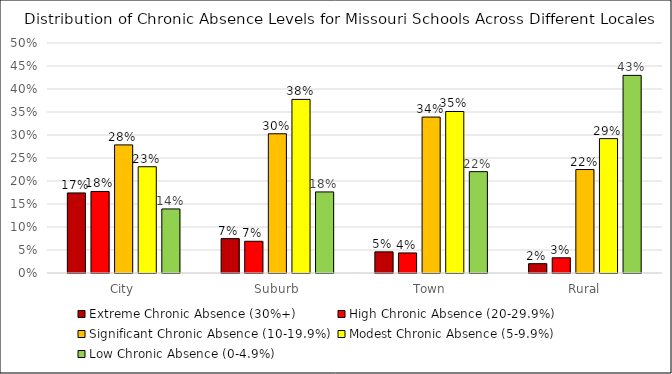
| Category | Extreme Chronic Absence (30%+) | High Chronic Absence (20-29.9%) | Significant Chronic Absence (10-19.9%) | Modest Chronic Absence (5-9.9%) | Low Chronic Absence (0-4.9%) |
|---|---|---|---|---|---|
| City | 0.174 | 0.177 | 0.278 | 0.231 | 0.139 |
| Suburb | 0.075 | 0.069 | 0.303 | 0.377 | 0.176 |
| Town | 0.046 | 0.044 | 0.339 | 0.351 | 0.22 |
| Rural | 0.02 | 0.033 | 0.225 | 0.292 | 0.43 |